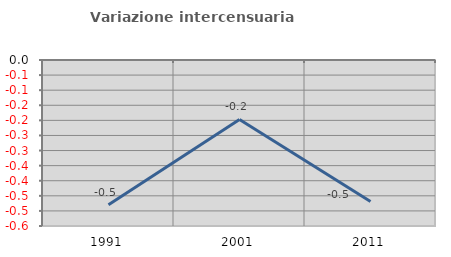
| Category | Variazione intercensuaria annua |
|---|---|
| 1991.0 | -0.48 |
| 2001.0 | -0.197 |
| 2011.0 | -0.469 |